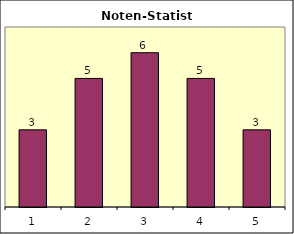
| Category | Series 0 | Series 1 |
|---|---|---|
| 0 |  | 3 |
| 1 |  | 5 |
| 2 |  | 6 |
| 3 |  | 5 |
| 4 |  | 3 |